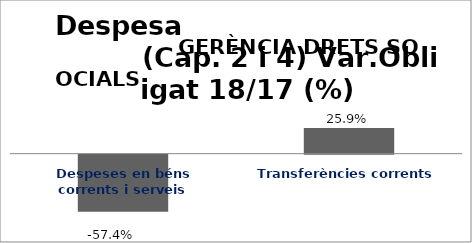
| Category | Series 0 |
|---|---|
| Despeses en béns corrents i serveis | -0.574 |
| Transferències corrents | 0.259 |